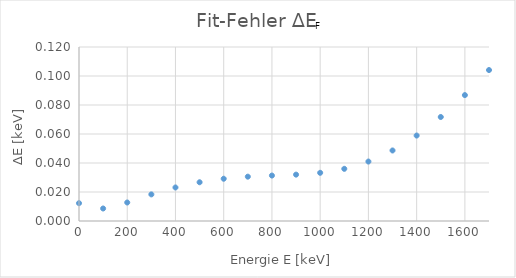
| Category | Series 0 |
|---|---|
| 0.0 | 0.012 |
| 100.0 | 0.009 |
| 200.0 | 0.013 |
| 300.0 | 0.018 |
| 400.0 | 0.023 |
| 500.0 | 0.027 |
| 600.0 | 0.029 |
| 700.0 | 0.031 |
| 800.0 | 0.031 |
| 900.0 | 0.032 |
| 1000.0 | 0.033 |
| 1100.0 | 0.036 |
| 1200.0 | 0.041 |
| 1300.0 | 0.049 |
| 1400.0 | 0.059 |
| 1500.0 | 0.072 |
| 1600.0 | 0.087 |
| 1700.0 | 0.104 |
| 1800.0 | 0.123 |
| 1900.0 | 0.145 |
| 2000.0 | 0.168 |